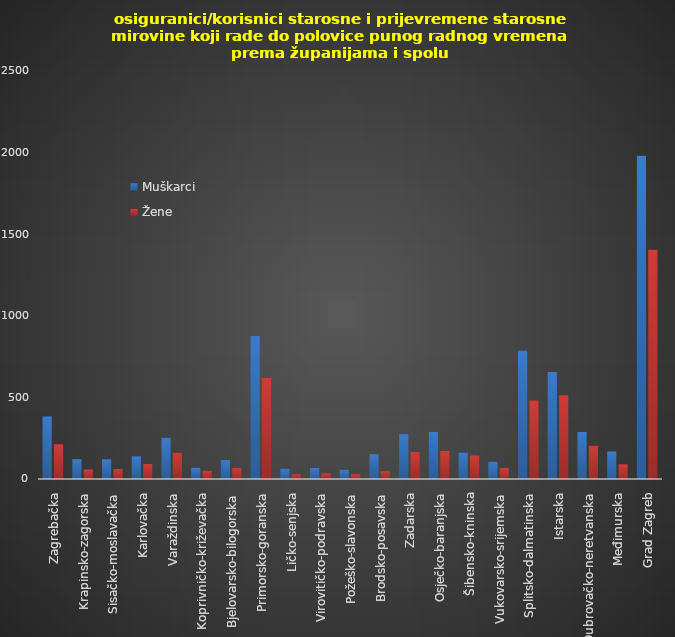
| Category | Muškarci | Žene |
|---|---|---|
| Zagrebačka | 383 | 213 |
| Krapinsko-zagorska | 122 | 59 |
| Sisačko-moslavačka | 121 | 61 |
| Karlovačka | 139 | 92 |
| Varaždinska | 253 | 161 |
| Koprivničko-križevačka | 70 | 51 |
| Bjelovarsko-bilogorska | 116 | 70 |
| Primorsko-goranska | 876 | 619 |
| Ličko-senjska | 64 | 29 |
| Virovitičko-podravska | 68 | 35 |
| Požeško-slavonska | 58 | 30 |
| Brodsko-posavska | 152 | 48 |
| Zadarska | 275 | 167 |
| Osječko-baranjska | 289 | 173 |
| Šibensko-kninska | 162 | 144 |
| Vukovarsko-srijemska | 106 | 69 |
| Splitsko-dalmatinska | 787 | 481 |
| Istarska | 655 | 513 |
| Dubrovačko-neretvanska | 288 | 205 |
| Međimurska | 169 | 90 |
| Grad Zagreb | 1980 | 1406 |